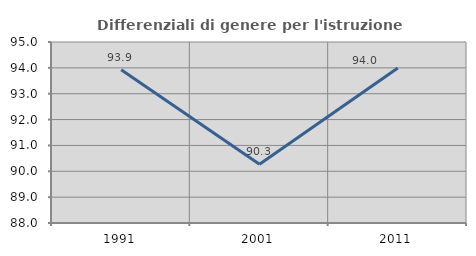
| Category | Differenziali di genere per l'istruzione superiore |
|---|---|
| 1991.0 | 93.926 |
| 2001.0 | 90.27 |
| 2011.0 | 93.995 |